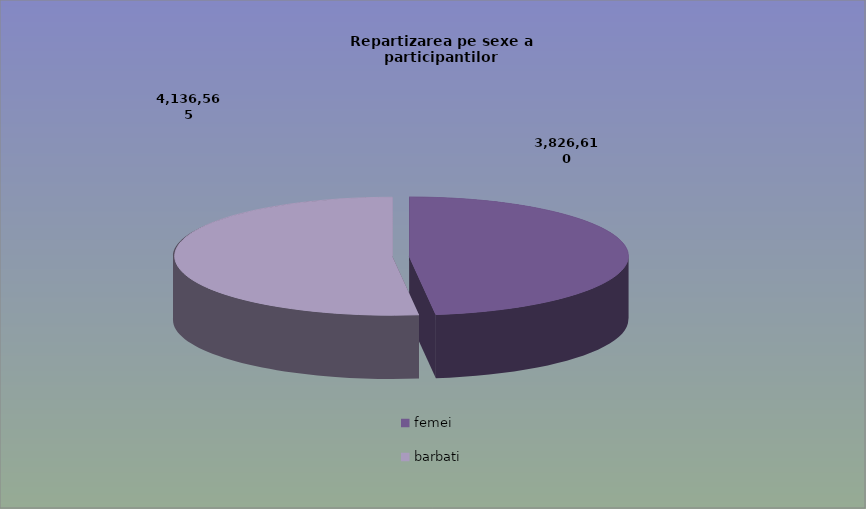
| Category | Series 0 |
|---|---|
| femei | 3826610 |
| barbati | 4136565 |